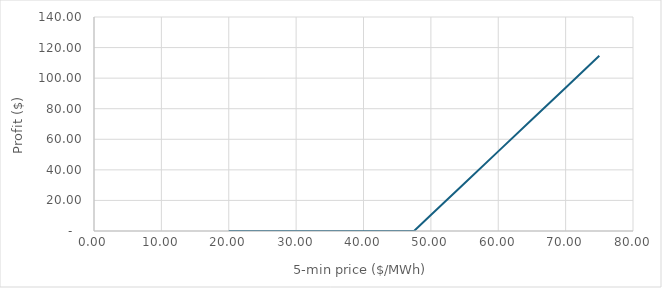
| Category | Series 0 |
|---|---|
| 20.0 | 0 |
| 25.0 | 0 |
| 30.0 | 0 |
| 35.0 | 0 |
| 40.0 | 0 |
| 45.0 | 0 |
| 47.5 | 0 |
| 50.0 | 10.417 |
| 55.0 | 31.25 |
| 60.0 | 52.083 |
| 65.0 | 72.917 |
| 70.0 | 93.75 |
| 75.0 | 114.583 |